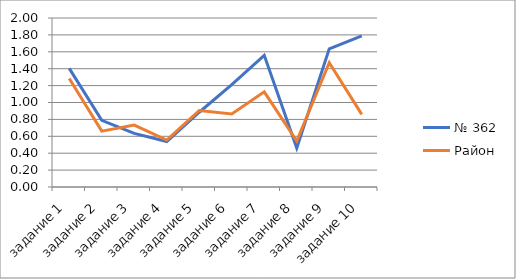
| Category | № 362 | Район |
|---|---|---|
| задание 1 | 1.404 | 1.284 |
| задание 2 | 0.788 | 0.661 |
| задание 3 | 0.635 | 0.733 |
| задание 4 | 0.538 | 0.555 |
| задание 5 | 0.885 | 0.906 |
| задание 6 | 1.212 | 0.865 |
| задание 7 | 1.558 | 1.127 |
| задание 8 | 0.462 | 0.543 |
| задание 9 | 1.635 | 1.472 |
| задание 10 | 1.788 | 0.859 |